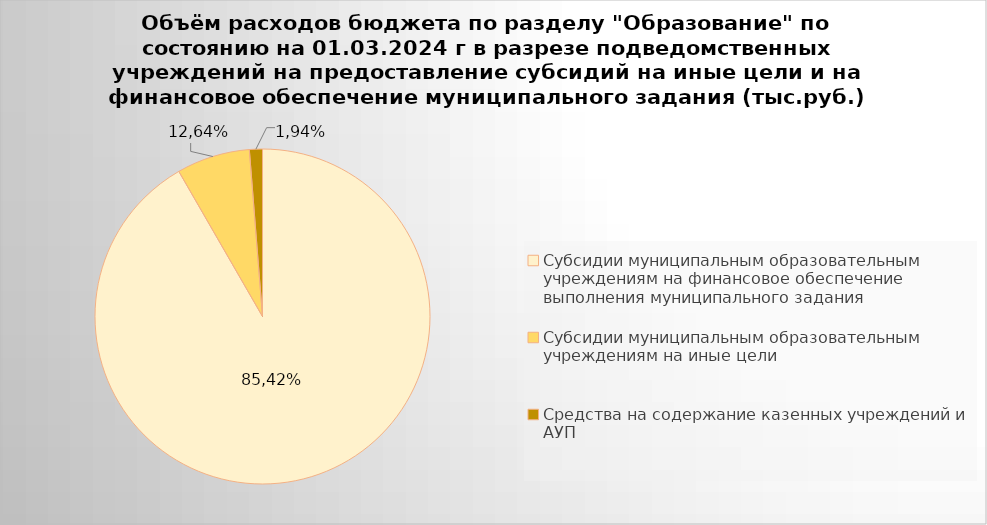
| Category | Series 0 |
|---|---|
| Субсидии муниципальным образовательным учреждениям на финансовое обеспечение выполнения муниципального задания | 9181560.7 |
| Субсидии муниципальным образовательным учреждениям на иные цели | 708292.92 |
| Средства на содержание казенных учреждений и АУП | 125516.73 |